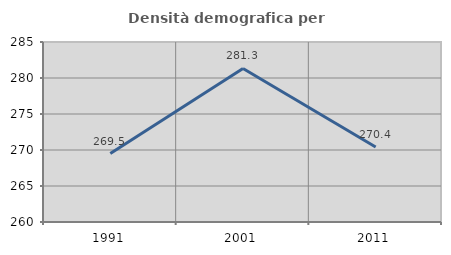
| Category | Densità demografica |
|---|---|
| 1991.0 | 269.5 |
| 2001.0 | 281.322 |
| 2011.0 | 270.409 |